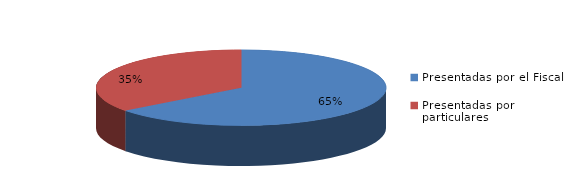
| Category | Series 0 |
|---|---|
| Presentadas por el Fiscal | 846 |
| Presentadas por particulares | 463 |